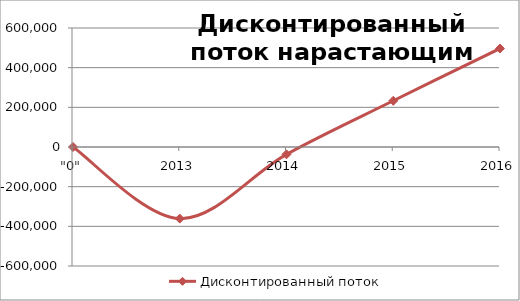
| Category | Дисконтированный поток нарастающим итогом |
|---|---|
| "0" | 0 |
| 2013 | -361054.752 |
| 2014 | -36967.465 |
| 2015 | 233047.577 |
| 2016 | 496671.375 |